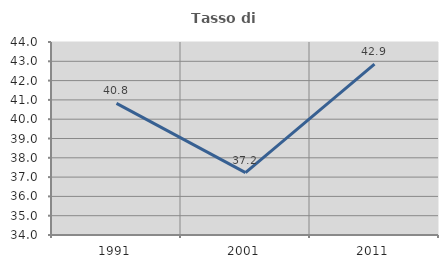
| Category | Tasso di occupazione   |
|---|---|
| 1991.0 | 40.823 |
| 2001.0 | 37.234 |
| 2011.0 | 42.857 |